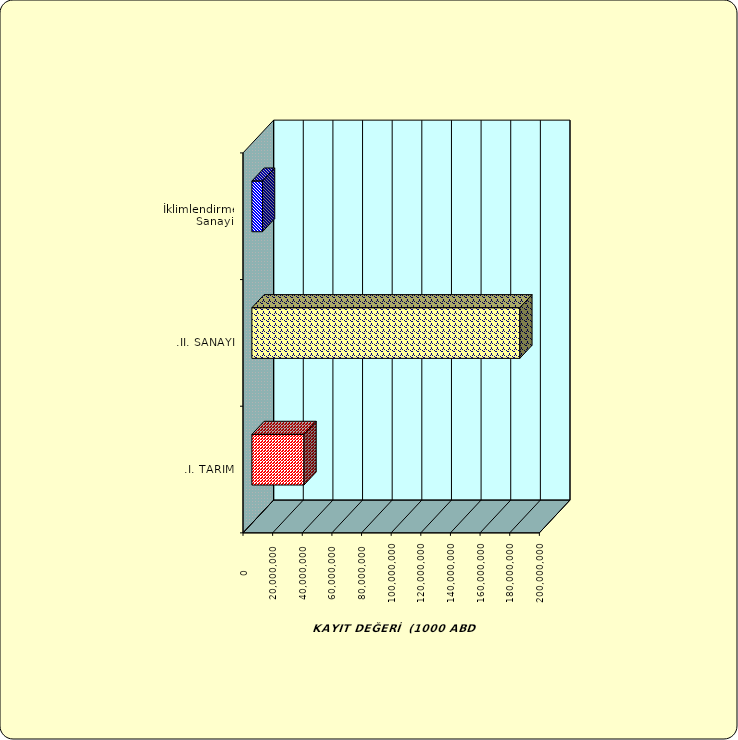
| Category | Series 0 |
|---|---|
| .I. TARIM | 35164253.133 |
| .II. SANAYİ | 180818622.89 |
|  İklimlendirme Sanayii | 7169534.078 |